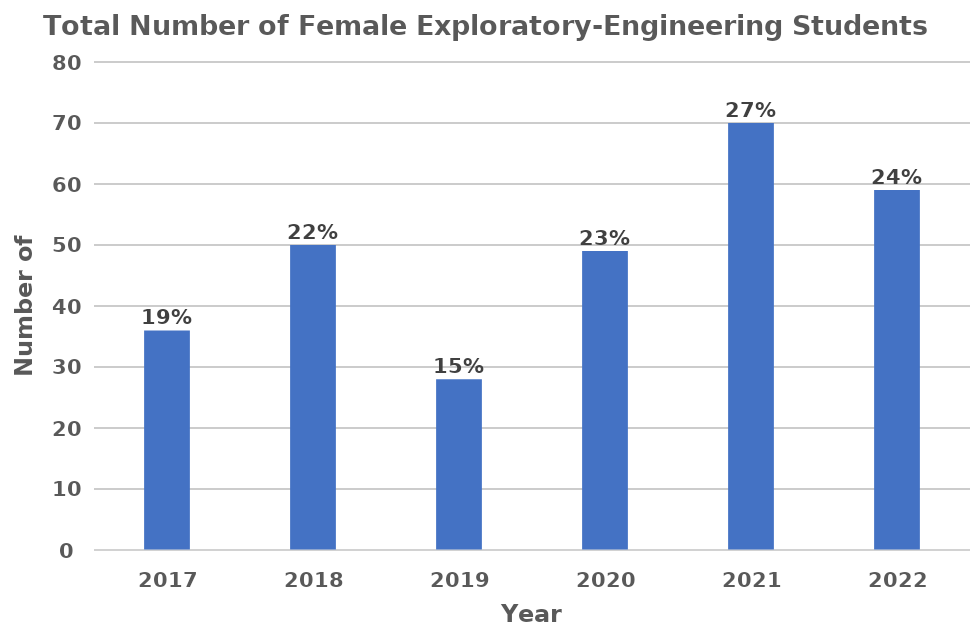
| Category | Total Number of Female Exporatory-Engineering Students |
|---|---|
| 2017.0 | 36 |
| 2018.0 | 50 |
| 2019.0 | 28 |
| 2020.0 | 49 |
| 2021.0 | 70 |
| 2022.0 | 59 |